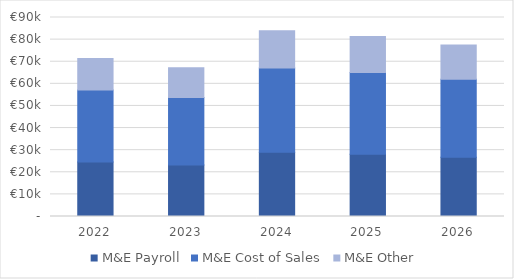
| Category | M&E Payroll | M&E Cost of Sales | M&E Other |
|---|---|---|---|
| 2022.0 | 24700 | 32500 | 14300 |
| 2023.0 | 23256 | 30600 | 13464 |
| 2024.0 | 29001.6 | 38160 | 16790.4 |
| 2025.0 | 28120 | 37000 | 16280 |
| 2026.0 | 26790 | 35250 | 15510 |